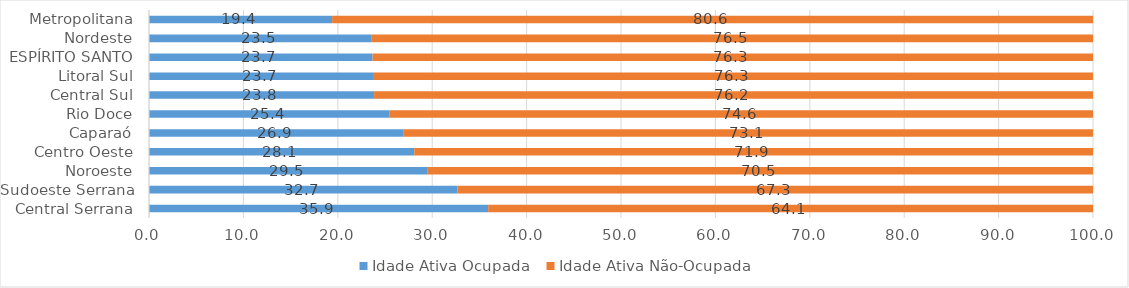
| Category | Idade Ativa Ocupada | Idade Ativa Não-Ocupada |
|---|---|---|
| Central Serrana | 35.927 | 64.073 |
| Sudoeste Serrana | 32.688 | 67.312 |
| Noroeste | 29.465 | 70.535 |
| Centro Oeste | 28.1 | 71.9 |
| Caparaó | 26.926 | 73.074 |
| Rio Doce | 25.446 | 74.554 |
| Central Sul | 23.846 | 76.154 |
| Litoral Sul | 23.729 | 76.271 |
| ESPÍRITO SANTO | 23.681 | 76.319 |
| Nordeste | 23.534 | 76.466 |
| Metropolitana | 19.397 | 80.603 |